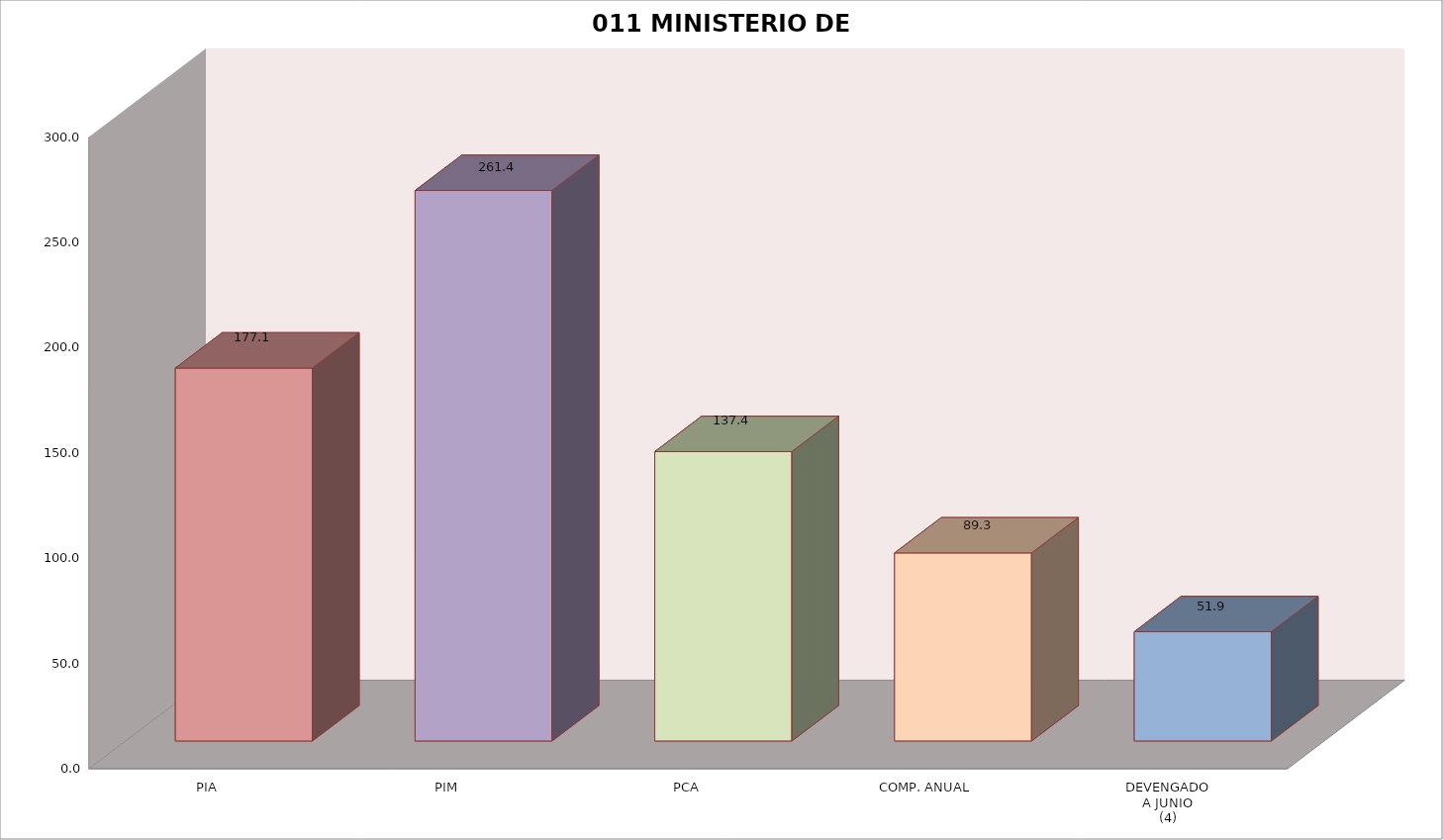
| Category | 011 MINISTERIO DE SALUD |
|---|---|
| PIA | 177.09 |
| PIM | 261.44 |
| PCA | 137.412 |
| COMP. ANUAL | 89.29 |
| DEVENGADO
A JUNIO
(4) | 51.875 |